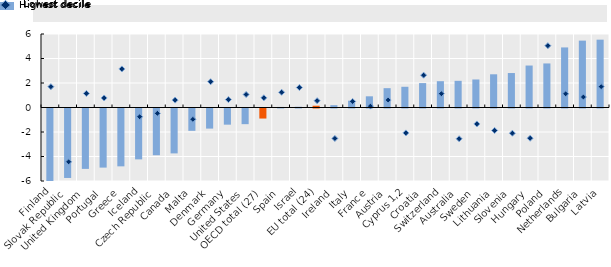
| Category | Lowest decile |
|---|---|
| Finland | -9.827 |
| Slovak Republic | -5.67 |
| United Kingdom | -4.93 |
| Portugal | -4.825 |
| Greece | -4.722 |
| Iceland | -4.153 |
| Czech Republic | -3.815 |
| Canada | -3.665 |
| Malta | -1.823 |
| Denmark | -1.641 |
| Germany | -1.32 |
| United States | -1.279 |
| OECD total (27) | -0.819 |
| Spain | 0.046 |
| Israel | 0.06 |
| EU total (24) | 0.143 |
| Ireland | 0.191 |
| Italy | 0.558 |
| France | 0.914 |
| Austria | 1.578 |
| Cyprus 1,2 | 1.692 |
| Croatia | 1.993 |
| Switzerland | 2.148 |
| Australia | 2.177 |
| Sweden | 2.288 |
| Lithuania | 2.711 |
| Slovenia | 2.813 |
| Hungary | 3.426 |
| Poland | 3.596 |
| Netherlands | 4.904 |
| Bulgaria | 5.459 |
| Latvia | 5.537 |